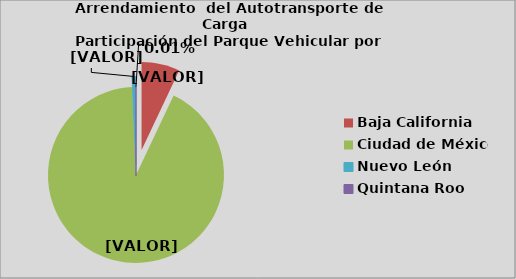
| Category | Series 0 |
|---|---|
| Baja California | 7.028 |
| Ciudad de México | 92.295 |
| Nuevo León | 0.662 |
| Quintana Roo | 0.015 |